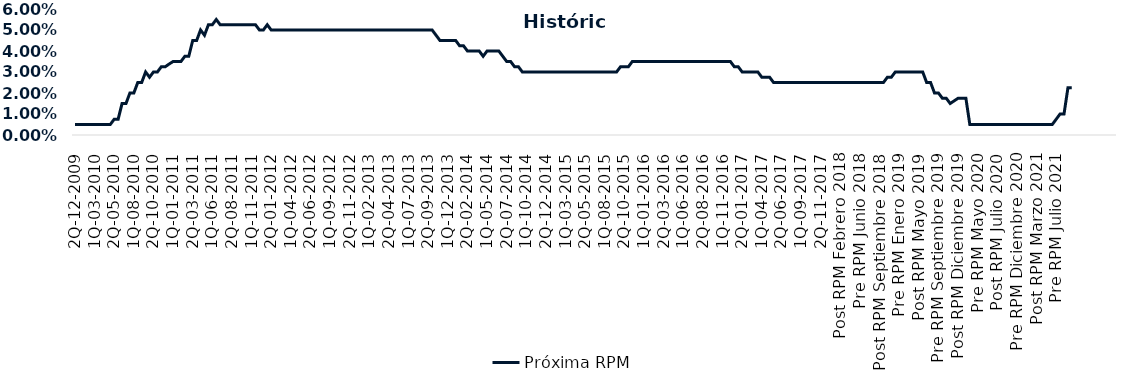
| Category | Próxima RPM |
|---|---|
| 2Q-12-2009 | 0.005 |
| 1Q-01-2010 | 0.005 |
| 2Q-01-2010 | 0.005 |
| 1Q-02-2010 | 0.005 |
| 2Q-02-2010 | 0.005 |
| 1Q-03-2010 | 0.005 |
| 2Q-03-2010 | 0.005 |
| 1Q-04-2010 | 0.005 |
| 2Q-04-2010 | 0.005 |
| 1Q-05-2010 | 0.005 |
| 2Q-05-2010 | 0.008 |
| 1Q-06-2010 | 0.008 |
| 2Q-06-2010 | 0.015 |
| 1Q-07-2010 | 0.015 |
| 2Q-07-2010 | 0.02 |
| 1Q-08-2010 | 0.02 |
| 2Q-08-2010 | 0.025 |
| 1Q-09-2010 | 0.025 |
| 2Q-09-2010 | 0.03 |
| 1Q-10-2010 | 0.028 |
| 2Q-10-2010 | 0.03 |
| 1Q-11-2010 | 0.03 |
| 2Q-11-2010 | 0.032 |
| 1Q-12-2010 | 0.032 |
| 2Q-12-2010 | 0.034 |
| 1Q-01-2011 | 0.035 |
| 2Q-01-2011 | 0.035 |
| 1Q-02-2011 | 0.035 |
| 2Q-02-2011 | 0.038 |
| 1Q-03-2011 | 0.038 |
| 2Q-03-2011 | 0.045 |
| 1Q-04-2011 | 0.045 |
| 2Q-04-2011 | 0.05 |
| 1Q-05-2011 | 0.048 |
| 2Q-05-2011 | 0.052 |
| 1Q-06-2011 | 0.052 |
| 2Q-06-2011 | 0.055 |
| 1Q-07-2011 | 0.052 |
| 2Q-07-2011 | 0.052 |
| 1Q-08-2011 | 0.052 |
| 2Q-08-2011 | 0.052 |
| 1Q-09-2011 | 0.052 |
| 2Q-09-2011 | 0.052 |
| 1Q-10-2011 | 0.052 |
| 2Q-10-2011 | 0.052 |
| 1Q-11-2011 | 0.052 |
| 2Q-11-2011 | 0.052 |
| 1Q-12-2011 | 0.05 |
| 2Q-12-2011 | 0.05 |
| 1Q-01-2012 | 0.052 |
| 2Q-01-2012 | 0.05 |
| 1Q-02-2012 | 0.05 |
| 2Q-02-2012 | 0.05 |
| 1Q-03-2012 | 0.05 |
| 2Q-03-2012 | 0.05 |
| 1Q-04-2012 | 0.05 |
| 2Q-04-2012 | 0.05 |
| 1Q-05-2012 | 0.05 |
| 2Q-05-2012 | 0.05 |
| 1Q-06-2012 | 0.05 |
| 2Q-06-2012 | 0.05 |
| 1Q-07-2012 | 0.05 |
| 2Q-07-2012 | 0.05 |
| 1Q-08-2012 | 0.05 |
| 2Q-08-2012 | 0.05 |
| 1Q-09-2012 | 0.05 |
| 2Q-09-2012 | 0.05 |
| 1Q-10-2012 | 0.05 |
| 2Q-10-2012 | 0.05 |
| 1Q-11-2012 | 0.05 |
| 2Q-11-2012 | 0.05 |
| 1Q-12-2012 | 0.05 |
| 2Q-12-2012 | 0.05 |
| 1Q-01-2013 | 0.05 |
| 2Q-01-2013 | 0.05 |
| 1Q-02-2013 | 0.05 |
| 2Q-02-2013 | 0.05 |
| 1Q-03-2013 | 0.05 |
| 2Q-03-2013 | 0.05 |
| 1Q-04-2013 | 0.05 |
| 2Q-04-2013 | 0.05 |
| 1Q-05-2013 | 0.05 |
| 2Q-05-2013 | 0.05 |
| 1Q-06-2013 | 0.05 |
| 2Q-06-2013 | 0.05 |
| 1Q-07-2013 | 0.05 |
| 2Q-07-2013 | 0.05 |
| 1Q-08-2013 | 0.05 |
| 2Q-08-2013 | 0.05 |
| 1Q-09-2013 | 0.05 |
| 2Q-09-2013 | 0.05 |
| 1Q-10-2013 | 0.05 |
| 2Q-10-2013 | 0.048 |
| 1Q-11-2013 | 0.045 |
| 2Q-11-2013 | 0.045 |
| 1Q-12-2013 | 0.045 |
| 2Q-12-2013 | 0.045 |
| 1Q-01-2014 | 0.045 |
| 2Q-01-2014 | 0.042 |
| 1Q-02-2014 | 0.042 |
| 2Q-02-2014 | 0.04 |
| 1Q-03-2014 | 0.04 |
| 2Q-03-2014 | 0.04 |
| 1Q-04-2014 | 0.04 |
| 2Q-04-2014 | 0.038 |
| 1Q-05-2014 | 0.04 |
| 2Q-05-2014 | 0.04 |
| 1Q-06-2014 | 0.04 |
| 2Q-06-2014 | 0.04 |
| 1Q-07-2014 | 0.038 |
| 2Q-07-2014 | 0.035 |
| 1Q-08-2014 | 0.035 |
| 2Q-08-2014 | 0.032 |
| 1Q-09-2014 | 0.032 |
| 2Q-09-2014 | 0.03 |
| 1Q-10-2014 | 0.03 |
| 2Q-10-2014 | 0.03 |
| 1Q-11-2014 | 0.03 |
| 2Q-11-2014 | 0.03 |
| 1Q-12-2014 | 0.03 |
| 2Q-12-2014 | 0.03 |
| 1Q-01-2015 | 0.03 |
| 2Q-01-2015 | 0.03 |
| 1Q-02-2015 | 0.03 |
| 2Q-02-2015 | 0.03 |
| 1Q-03-2015 | 0.03 |
| 2Q-03-2015 | 0.03 |
| 1Q-04-2015 | 0.03 |
| 2Q-04-2015 | 0.03 |
| 1Q-05-2015 | 0.03 |
| 2Q-05-2015 | 0.03 |
| 1Q-06-2015 | 0.03 |
| 2Q-06-2015 | 0.03 |
| 1Q-07-2015 | 0.03 |
| 2Q-07-2015 | 0.03 |
| 1Q-08-2015 | 0.03 |
| 2Q-08-2015 | 0.03 |
| 1Q-09-2015 | 0.03 |
| 2Q-09-2015 | 0.03 |
| 1Q-10-2015 | 0.032 |
| 2Q-10-2015 | 0.032 |
| 1Q-11-2015 | 0.032 |
| 2Q-11-2015 | 0.035 |
| 1Q-12-2015 | 0.035 |
| 2Q-12-2015 | 0.035 |
| 1Q-01-2016 | 0.035 |
| 2Q-01-2016 | 0.035 |
| 1Q-02-2016 | 0.035 |
| 2Q-02-2016 | 0.035 |
| 1Q-03-2016 | 0.035 |
| 2Q-03-2016 | 0.035 |
| 1Q-04-2016 | 0.035 |
| 2Q-04-2016 | 0.035 |
| 1Q-05-2016 | 0.035 |
| 2Q-05-2016 | 0.035 |
| 1Q-06-2016 | 0.035 |
| 2Q-06-2016 | 0.035 |
| 1Q-07-2016 | 0.035 |
| 2Q-07-2016 | 0.035 |
| 1Q-08-2016 | 0.035 |
| 2Q-08-2016 | 0.035 |
| 1Q-09-2016 | 0.035 |
| 2Q-09-2016 | 0.035 |
| 1Q-10-2016 | 0.035 |
| 2Q-10-2016 | 0.035 |
| 1Q-11-2016 | 0.035 |
| 2Q-11-2016 | 0.035 |
| 1Q-12-2016 | 0.035 |
| 2Q-12-2016 | 0.032 |
| 1Q-01-2017 | 0.032 |
| 2Q-01-2017 | 0.03 |
| 1Q-02-2017 | 0.03 |
| 2Q-02-2017 | 0.03 |
| 1Q-03-2017 | 0.03 |
| 2Q-03-2017 | 0.03 |
| 1Q-04-2017 | 0.028 |
| 2Q-04-2017 | 0.028 |
| 1Q-05-2017 | 0.028 |
| 2Q-05-2017 | 0.025 |
| 1Q-06-2017 | 0.025 |
| 2Q-06-2017 | 0.025 |
| 1Q-07-2017 | 0.025 |
| 2Q-07-2017 | 0.025 |
| 1Q-08-2017 | 0.025 |
| 2Q-08-2017 | 0.025 |
| 1Q-09-2017 | 0.025 |
| 2Q-09-2017 | 0.025 |
| 1Q-10-2017 | 0.025 |
| 2Q-10-2017 | 0.025 |
| 1Q-11-2017 | 0.025 |
| 2Q-11-2017 | 0.025 |
| 1Q-12-2017 | 0.025 |
| 2Q-12-2017 | 0.025 |
| 1Q-01-2018 | 0.025 |
| 2Q-01-2018 | 0.025 |
| Post RPM Febrero 2018 | 0.025 |
| Pre RPM Marzo 2018 | 0.025 |
| Post RPM Marzo 2018 | 0.025 |
| Pre RPM Mayo 2018 | 0.025 |
| Post RPM Mayo 2018 | 0.025 |
| Pre RPM Junio 2018 | 0.025 |
| Post RPM Junio 2018 | 0.025 |
| Pre RPM Julio 2018 | 0.025 |
| Post RPM Julio 2018 | 0.025 |
| Pre RPM Septiembre 2018 | 0.025 |
| Post RPM Septiembre 2018 | 0.025 |
| Pre RPM Octubre 2018 | 0.025 |
| Post RPM Octubre 2018 | 0.028 |
| Pre RPM Diciembre 2018 | 0.028 |
| Post RPM Diciembre 2018 | 0.03 |
| Pre RPM Enero 2019 | 0.03 |
| Post RPM Enero 2019 | 0.03 |
| Pre RPM Marzo 2019 | 0.03 |
| Post RPM Marzo 2019 | 0.03 |
| Pre RPM Mayo 2019 | 0.03 |
| Post RPM Mayo 2019 | 0.03 |
| Pre RPM Junio 2019 | 0.03 |
| Post RPM Junio 2019 | 0.025 |
| Pre RPM Julio 2019 | 0.025 |
| Post RPM Julio 2019 | 0.02 |
| Pre RPM Septiembre 2019 | 0.02 |
| Post RPM Septiembre 2019 | 0.018 |
| Pre RPM Octubre 2019 | 0.018 |
| Post RPM Octubre 2019 | 0.015 |
| Pre RPM Diciembre 2019 | 0.016 |
| Post RPM Diciembre 2019 | 0.018 |
| Pre RPM Enero 2020 | 0.018 |
| Post RPM Enero 2020 | 0.018 |
| Pre RPM Marzo 2020 | 0.005 |
| Post RPM Marzo 2020 | 0.005 |
| Pre RPM Mayo 2020 | 0.005 |
| Post RPM Mayo 2020 | 0.005 |
| Pre RPM Junio 2020 | 0.005 |
| Post RPM Junio 2020 | 0.005 |
| Pre RPM Julio 2020 | 0.005 |
| Post RPM Julio 2020 | 0.005 |
| Pre RPM Septiembre 2020 | 0.005 |
| Post RPM Septiembre 2020 | 0.005 |
| Pre RPM Octubre 2020 | 0.005 |
| Post RPM Octubre 2020 | 0.005 |
| Pre RPM Diciembre 2020 | 0.005 |
| Post RPM Diciembre 2020 | 0.005 |
| Pre RPM Enero 2021 | 0.005 |
| Post RPM Enero 2021 | 0.005 |
| Pre RPM Marzo 2021 | 0.005 |
| Post RPM Marzo 2021 | 0.005 |
| Pre RPM Mayo 2021 | 0.005 |
| Post RPM Mayo 2021 | 0.005 |
| Pre RPM Junio 2021 | 0.005 |
| Post RPM Junio 2021 | 0.005 |
| Pre RPM Julio 2021 | 0.008 |
| Post RPM Julio 2021 | 0.01 |
| Pre RPM Agosto 2021 | 0.01 |
| Post RPM Agosto 2021 | 0.022 |
| Pre RPM Octubre 2021 | 0.022 |